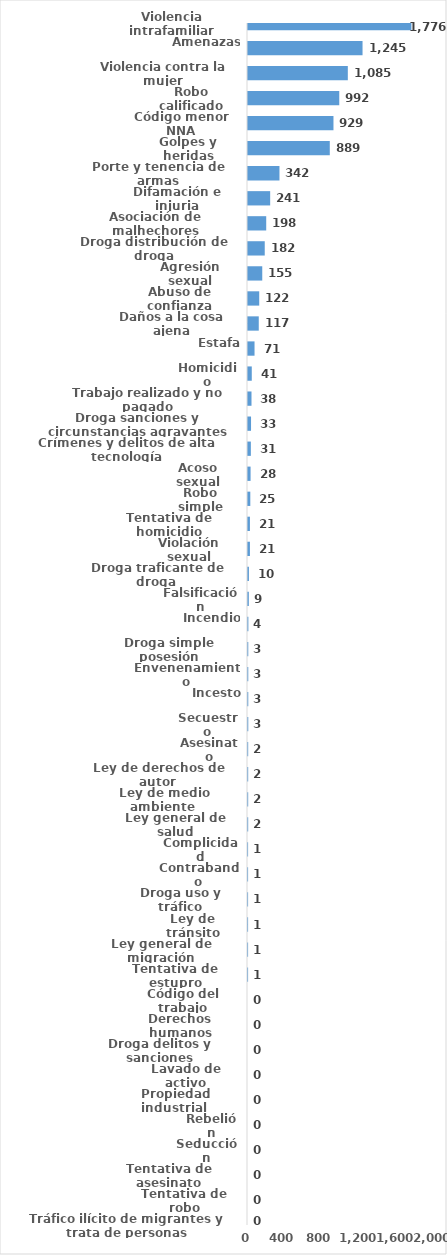
| Category | Series 0 |
|---|---|
| Violencia intrafamiliar | 1776 |
| Amenazas | 1245 |
| Violencia contra la mujer | 1085 |
| Robo calificado | 992 |
| Código menor NNA | 929 |
| Golpes y heridas | 889 |
| Porte y tenencia de armas | 342 |
| Difamación e injuria | 241 |
| Asociación de malhechores | 198 |
| Droga distribución de droga | 182 |
| Agresión sexual | 155 |
| Abuso de confianza | 122 |
| Daños a la cosa ajena | 117 |
| Estafa | 71 |
| Homicidio | 41 |
| Trabajo realizado y no pagado | 38 |
| Droga sanciones y circunstancias agravantes | 33 |
| Crímenes y delitos de alta tecnología | 31 |
| Acoso sexual | 28 |
| Robo simple | 25 |
| Tentativa de homicidio | 21 |
| Violación sexual | 21 |
| Droga traficante de droga  | 10 |
| Falsificación | 9 |
| Incendio | 4 |
| Droga simple posesión | 3 |
| Envenenamiento | 3 |
| Incesto | 3 |
| Secuestro | 3 |
| Asesinato | 2 |
| Ley de derechos de autor  | 2 |
| Ley de medio ambiente  | 2 |
| Ley general de salud | 2 |
| Complicidad | 1 |
| Contrabando | 1 |
| Droga uso y tráfico | 1 |
| Ley de tránsito | 1 |
| Ley general de migración | 1 |
| Tentativa de estupro | 1 |
| Código del trabajo | 0 |
| Derechos humanos | 0 |
| Droga delitos y sanciones | 0 |
| Lavado de activo | 0 |
| Propiedad industrial  | 0 |
| Rebelión | 0 |
| Seducción | 0 |
| Tentativa de asesinato | 0 |
| Tentativa de robo | 0 |
| Tráfico ilícito de migrantes y trata de personas | 0 |